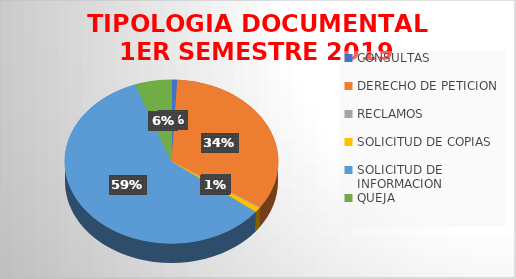
| Category | Series 0 |
|---|---|
| CONSULTAS  | 6 |
| DERECHO DE PETICION | 236 |
| RECLAMOS  | 1 |
| SOLICITUD DE COPIAS  | 7 |
| SOLICITUD DE INFORMACION | 414 |
| QUEJA | 39 |